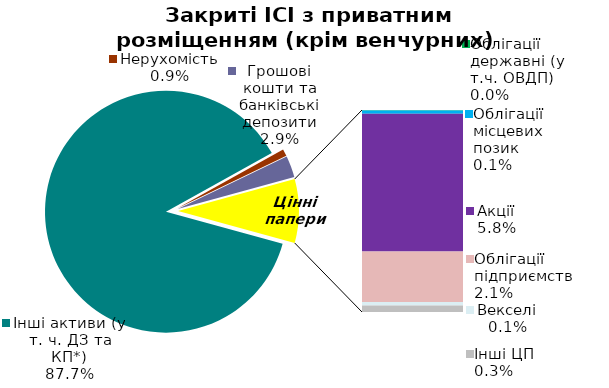
| Category | Series 0 |
|---|---|
| Інші активи (у т. ч. ДЗ та КП*) | 0.877 |
| Нерухомість | 0.009 |
| Грошові кошти та банківські депозити | 0.029 |
| Банківські метали | 0 |
| Облігації державні (у т.ч. ОВДП) | 0 |
| Облігації місцевих позик | 0.001 |
| Акції | 0.058 |
| Облігації підприємств | 0.021 |
| Векселі | 0.001 |
| Інші ЦП  | 0.003 |